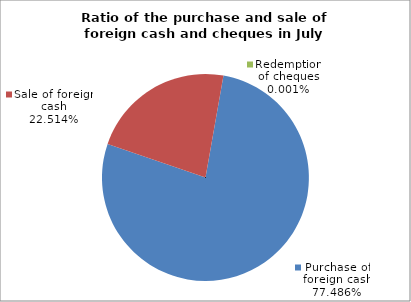
| Category | Purchase of foreign cash |
|---|---|
| 0 | 0.775 |
| 1 | 0.225 |
| 2 | 0 |